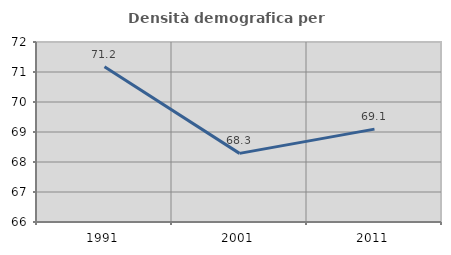
| Category | Densità demografica |
|---|---|
| 1991.0 | 71.173 |
| 2001.0 | 68.287 |
| 2011.0 | 69.095 |